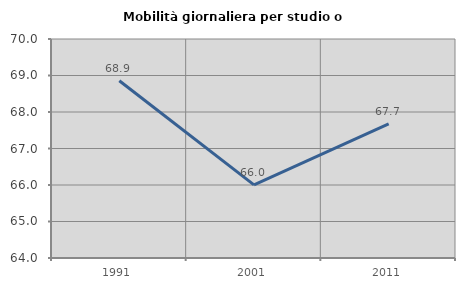
| Category | Mobilità giornaliera per studio o lavoro |
|---|---|
| 1991.0 | 68.855 |
| 2001.0 | 66.002 |
| 2011.0 | 67.672 |